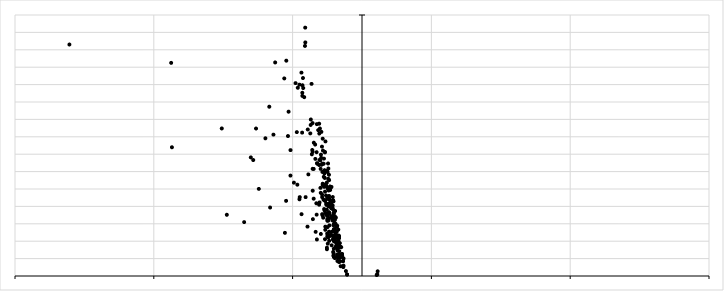
| Category | EDGE.test..mCherrylo.vs.RTOC_mCherryhi..tagwise.dispersions...P.value |
|---|---|
| -13.7486955299 | 0 |
| -7.4331790977 | 0 |
| -10.1019951182 | 0 |
| -8.0097905312 | 0 |
| -8.4893569306 | 0.001 |
| -6.3807079438 | 0 |
| -5.4688843924 | 0 |
| -6.2564541378 | 0 |
| -6.6210736528 | 0 |
| -6.6796825495 | 0 |
| -8.4129826014 | 0 |
| -4.3551999632 | 0 |
| -5.6002363443 | 0 |
| -5.3329799834 | 0 |
| -5.4533742165 | 0 |
| -2.5820969201 | 0 |
| -2.6580228558 | 0 |
| -21.0807928646 | 0 |
| -6.9590553597 | 0 |
| -13.6931461213 | 0 |
| -4.0619397148 | 0 |
| -7.8354017619 | 0 |
| -4.5062848293 | 0 |
| -3.9074981997 | 0 |
| -4.4844462145 | 0 |
| -5.2894157217 | 0 |
| -4.3138989214 | 0 |
| -3.9271663821 | 0.001 |
| -4.7871610407 | 0 |
| -3.5380573429 | 0.001 |
| -4.0843669226 | 0 |
| -4.6961455538 | 0 |
| -3.5834900718 | 0 |
| -4.2344953116 | 0 |
| -4.3633436496 | 0 |
| -4.1625303123 | 0 |
| -2.8711946507 | 0 |
| -3.8651717341 | 0 |
| -4.1075653951 | 0 |
| -2.5281198578 | 0.029 |
| -4.3001895852 | 0 |
| -3.7244369384 | 0 |
| -4.2982084255 | 0 |
| -3.5598675629 | 0 |
| -3.5557716509 | 0 |
| -5.4206030457 | 0 |
| -2.7737775766 | 0 |
| -3.0533413911 | 0 |
| -4.6257611735 | 0 |
| -3.6336842985 | 0 |
| -2.8534111246 | 0 |
| 1.0582799727 | 0.877 |
| -5.154658242 | 0 |
| -3.0762384396 | 0 |
| -3.6957626159 | 0 |
| -2.5358475648 | 0 |
| -3.0313735048 | 0 |
| -5.1522959665 | 0 |
| -3.5497624442 | 0 |
| -2.645519058 | 0 |
| -4.0906991037 | 0 |
| -2.8762091855 | 0 |
| -3.3746983634 | 0 |
| -2.5914892126 | 0 |
| -3.4711396302 | 0 |
| -3.3601566892 | 0 |
| -2.8318961 | 0 |
| -4.2887046225 | 0 |
| -3.5543476419 | 0 |
| -2.8107670345 | 0 |
| -3.2079155507 | 0 |
| -3.2686862394 | 0 |
| -3.6873422662 | 0 |
| -2.3740477252 | 0 |
| -2.9250807583 | 0 |
| -4.5094921248 | 0 |
| -2.0293869447 | 0.07 |
| -2.4011873945 | 0 |
| -2.4965446334 | 0.001 |
| -2.6660831989 | 0.008 |
| -1.7048454939 | 0.007 |
| -4.6583604603 | 0 |
| -2.9797522249 | 0 |
| -2.6974171159 | 0 |
| -2.0672973452 | 0.008 |
| -1.0742429834 | 0.811 |
| -9.739410637 | 0 |
| -1.3485192731 | 0.308 |
| -3.1556671989 | 0 |
| -3.3380600038 | 0.003 |
| -2.7292951013 | 0 |
| -2.6771867763 | 0 |
| -3.2427302246 | 0 |
| -3.0875678661 | 0 |
| -2.4163640002 | 0 |
| -3.4811649778 | 0 |
| -2.6437059349 | 0.001 |
| -3.4815853696 | 0 |
| -7.6353198752 | 0 |
| -1.7085750594 | 0.002 |
| -2.5128405877 | 0 |
| -3.2489142675 | 0.008 |
| -2.8681893121 | 0 |
| -2.9172491028 | 0 |
| -2.3934873867 | 0 |
| -2.8845466989 | 0 |
| -2.3605412583 | 0.01 |
| -2.4508018196 | 0 |
| -2.3415487539 | 0.005 |
| -2.6691677388 | 0 |
| -2.2984477063 | 0 |
| -4.9056427647 | 0 |
| -2.9928316453 | 0 |
| -2.2072926812 | 0 |
| -2.2934968245 | 0 |
| -2.7053027283 | 0 |
| -2.3577624905 | 0.005 |
| -2.4763343968 | 0 |
| -2.8411920831 | 0 |
| -2.0264251032 | 0.001 |
| -2.3522508117 | 0 |
| -2.3648782433 | 0 |
| -2.3002320753 | 0 |
| -1.5983631215 | 0.061 |
| -5.5539814919 | 0.003 |
| -2.806985948 | 0 |
| -2.0272935761 | 0.081 |
| -2.3497604311 | 0.001 |
| -1.7837249873 | 0.083 |
| -2.941888222 | 0 |
| -3.0657499352 | 0 |
| -2.698809044 | 0 |
| -2.5369811937 | 0 |
| -2.6633838415 | 0 |
| -2.3799058392 | 0 |
| -2.6907261026 | 0 |
| -3.0855283944 | 0 |
| -2.6343736708 | 0 |
| -2.4997061932 | 0.001 |
| -2.4092933328 | 0 |
| -2.7597218614 | 0 |
| -3.2674890304 | 0 |
| -2.0923910823 | 0.008 |
| -2.2009749222 | 0 |
| -2.1860168665 | 0.017 |
| -3.0901530505 | 0 |
| -2.3476216564 | 0 |
| -2.3594477904 | 0 |
| -3.2897356468 | 0 |
| -2.2069291507 | 0 |
| -2.6812140748 | 0 |
| -2.5852673426 | 0 |
| -2.4324619606 | 0.006 |
| -2.6689254571 | 0 |
| -2.4215412407 | 0.001 |
| -1.8901886307 | 0.02 |
| -1.8323560408 | 0.011 |
| -2.9698897426 | 0 |
| -2.0402841493 | 0.002 |
| -1.7917360878 | 0.061 |
| -2.1436077907 | 0 |
| -1.9456603122 | 0.002 |
| -1.9175687805 | 0.006 |
| -2.8482179034 | 0 |
| -1.6982412049 | 0.009 |
| -3.6133963724 | 0 |
| -2.063652751 | 0.067 |
| -2.3659434155 | 0 |
| -2.0590500282 | 0.006 |
| -2.2049528702 | 0.005 |
| -1.96033557 | 0.001 |
| -2.4458068466 | 0 |
| -2.4223834729 | 0 |
| -2.1342731315 | 0.001 |
| -2.5108181666 | 0.004 |
| -4.250951129 | 0 |
| -2.1993243941 | 0 |
| -2.1938260616 | 0 |
| -2.4628078943 | 0.014 |
| -1.9947256767 | 0 |
| -2.2169223344 | 0 |
| -3.0005378598 | 0 |
| -2.7419332491 | 0 |
| -2.0774830443 | 0.041 |
| -2.4295388022 | 0 |
| -2.7937645303 | 0 |
| -1.8134261771 | 0.003 |
| -2.9629805032 | 0.004 |
| -2.0372420538 | 0 |
| -2.7327132187 | 0 |
| -1.8560275388 | 0.013 |
| -2.3719290538 | 0.003 |
| -1.9833109074 | 0 |
| -2.8313020804 | 0 |
| -2.5316536023 | 0 |
| -2.1124408749 | 0 |
| -2.5886895263 | 0 |
| -2.6453205743 | 0.002 |
| -2.5633822068 | 0 |
| -1.158377245 | 0.52 |
| -2.8326694808 | 0 |
| -1.808354377 | 0.011 |
| -1.9571791435 | 0 |
| -2.0412642179 | 0.051 |
| -2.5016819731 | 0 |
| -2.0772040218 | 0.001 |
| -2.2532202752 | 0 |
| -2.0666700785 | 0 |
| -2.5133278483 | 0 |
| -2.3929809812 | 0 |
| -1.7728097762 | 0.135 |
| -1.7627558379 | 0.011 |
| -2.0547639044 | 0 |
| -2.2983692549 | 0 |
| -1.8014595557 | 0.026 |
| -2.3071804407 | 0 |
| -1.5694962362 | 0.087 |
| -2.750699424 | 0 |
| -2.1029117242 | 0 |
| 1.1284793997 | 0.537 |
| -6.0331076712 | 0 |
| -2.0150204956 | 0.002 |
| -2.1069704129 | 0 |
| -1.9085370605 | 0.001 |
| -1.7852911519 | 0.001 |
| -1.6998401491 | 0.147 |
| -2.0435189726 | 0.003 |
| -2.0526318073 | 0 |
| -2.4229854123 | 0 |
| -2.6926239501 | 0 |
| -2.0737420298 | 0.005 |
| -2.2202085342 | 0 |
| -1.8682703201 | 0.003 |
| -2.1911195888 | 0 |
| -1.9611471604 | 0.093 |
| -1.4200161986 | 0.077 |
| -2.1792829086 | 0.003 |
| -1.3279662119 | 0.099 |
| -2.0782107303 | 0.001 |
| -1.9821986188 | 0.008 |
| -2.2467827077 | 0.004 |
| -2.9577717729 | 0 |
| -2.2801175213 | 0 |
| -1.637454203 | 0.092 |
| -1.3586827627 | 0.142 |
| -1.9561465619 | 0.001 |
| -1.6450755978 | 0.066 |
| -2.1266872771 | 0 |
| -1.8004958914 | 0.005 |
| -1.6406261078 | 0.018 |
| -1.5986881021 | 0.013 |
| -2.4478623081 | 0 |
| -1.6882839933 | 0.018 |
| -2.0277299309 | 0 |
| -1.6956323903 | 0.024 |
| -1.5445584222 | 0.021 |
| -2.0950441835 | 0 |
| -2.3635204089 | 0 |
| -3.2534598597 | 0 |
| -1.7738722011 | 0.058 |
| -2.0802124572 | 0 |
| -1.5350124198 | 0.273 |
| -2.5280614616 | 0.024 |
| -2.4459183375 | 0 |
| -2.0546390715 | 0.001 |
| -2.0460873248 | 0.008 |
| -1.9128781918 | 0.004 |
| -1.7370762466 | 0.013 |
| -2.0300755755 | 0.027 |
| -1.9350553901 | 0 |
| -2.7295066501 | 0 |
| -2.4804345375 | 0.002 |
| -1.5731656437 | 0.144 |
| -1.6393726096 | 0.157 |
| -1.6767204264 | 0.005 |
| 1.1013843418 | 0.797 |
| -1.6028300056 | 0.057 |
| -2.0667383488 | 0.001 |
| -1.6372967751 | 0.013 |
| -2.5003817069 | 0.005 |
| -1.7727470998 | 0.033 |
| -1.4974477898 | 0.022 |
| -1.6830516699 | 0.056 |
| -1.8550739985 | 0.006 |
| -1.7172282593 | 0.071 |
| -2.0596986953 | 0.001 |
| -1.7108306964 | 0.02 |
| -1.6493645179 | 0.007 |
| -1.3304279489 | 0.255 |
| -1.7952539103 | 0.001 |
| -1.0727717417 | 0.83 |
| -1.6390144032 | 0.037 |
| -1.4400887421 | 0.054 |
| -1.4334918537 | 0.056 |
| -1.6488833146 | 0.005 |
| -1.8331316529 | 0.001 |
| -1.4304558183 | 0.074 |
| -2.0188858022 | 0.01 |
| -1.9150677189 | 0.003 |
| -1.8813483642 | 0 |
| -1.9234461693 | 0.006 |